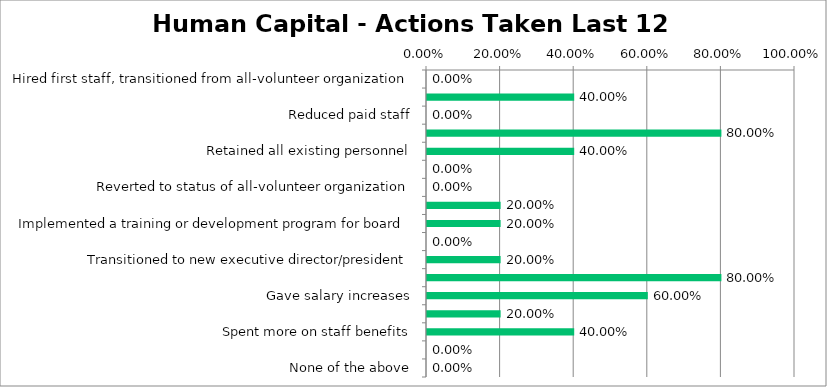
| Category | Responses |
|---|---|
| Hired first staff, transitioned from all-volunteer organization | 0 |
| Hired staff for new positions | 0.4 |
| Reduced paid staff | 0 |
| Made replacement hires | 0.8 |
| Retained all existing personnel | 0.4 |
| Reduced staff hours (short weeks, furloughs, etc.) | 0 |
| Reverted to status of all-volunteer organization | 0 |
| Engaged more closely with board via more frequent reports/meetings | 0.2 |
| Implemented a training or development program for board | 0.2 |
| Completed leadership succession planning | 0 |
| Transitioned to new executive director/president | 0.2 |
| Invested money/time in professional development for staff | 0.8 |
| Gave salary increases | 0.6 |
| Froze or reduced salaries | 0.2 |
| Spent more on staff benefits | 0.4 |
| Spent less on staff benefits | 0 |
| None of the above | 0 |